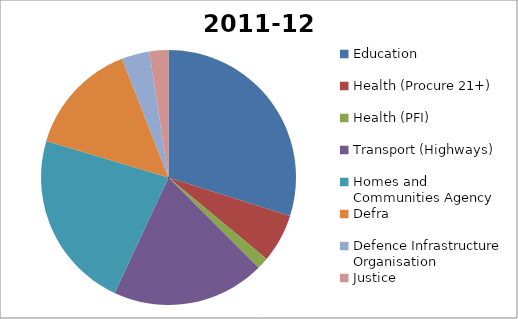
| Category | 2011-12 |
|---|---|
| Education |  |
| Health (Procure 21+) |  |
| Health (PFI) |  |
| Transport (Highways) |  |
| Homes and Communities Agency |  |
| Defra |  |
| Defence Infrastructure Organisation |  |
| Justice |  |